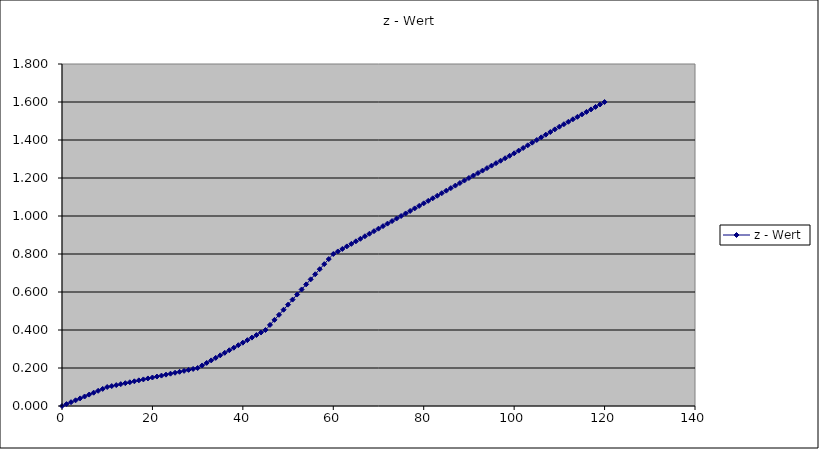
| Category | z - Wert |
|---|---|
| 0.0 | 0 |
| 1.0 | 0.01 |
| 2.0 | 0.02 |
| 3.0 | 0.03 |
| 4.0 | 0.04 |
| 5.0 | 0.05 |
| 6.0 | 0.06 |
| 7.0 | 0.07 |
| 8.0 | 0.08 |
| 9.0 | 0.09 |
| 10.0 | 0.1 |
| 11.0 | 0.105 |
| 12.0 | 0.11 |
| 13.0 | 0.115 |
| 14.0 | 0.12 |
| 15.0 | 0.125 |
| 16.0 | 0.13 |
| 17.0 | 0.135 |
| 18.0 | 0.14 |
| 19.0 | 0.145 |
| 20.0 | 0.15 |
| 21.0 | 0.155 |
| 22.0 | 0.16 |
| 23.0 | 0.165 |
| 24.0 | 0.17 |
| 25.0 | 0.175 |
| 26.0 | 0.18 |
| 27.0 | 0.185 |
| 28.0 | 0.19 |
| 29.0 | 0.195 |
| 30.0 | 0.2 |
| 31.0 | 0.213 |
| 32.0 | 0.227 |
| 33.0 | 0.24 |
| 34.0 | 0.253 |
| 35.0 | 0.267 |
| 36.0 | 0.28 |
| 37.0 | 0.293 |
| 38.0 | 0.307 |
| 39.0 | 0.32 |
| 40.0 | 0.333 |
| 41.0 | 0.347 |
| 42.0 | 0.36 |
| 43.0 | 0.373 |
| 44.0 | 0.387 |
| 45.0 | 0.4 |
| 46.0 | 0.427 |
| 47.0 | 0.453 |
| 48.0 | 0.48 |
| 49.0 | 0.507 |
| 50.0 | 0.533 |
| 51.0 | 0.56 |
| 52.0 | 0.587 |
| 53.0 | 0.613 |
| 54.0 | 0.64 |
| 55.0 | 0.667 |
| 56.0 | 0.693 |
| 57.0 | 0.72 |
| 58.0 | 0.747 |
| 59.0 | 0.773 |
| 60.0 | 0.8 |
| 61.0 | 0.813 |
| 62.0 | 0.827 |
| 63.0 | 0.84 |
| 64.0 | 0.853 |
| 65.0 | 0.867 |
| 66.0 | 0.88 |
| 67.0 | 0.893 |
| 68.0 | 0.907 |
| 69.0 | 0.92 |
| 70.0 | 0.933 |
| 71.0 | 0.947 |
| 72.0 | 0.96 |
| 73.0 | 0.973 |
| 74.0 | 0.987 |
| 75.0 | 1 |
| 76.0 | 1.013 |
| 77.0 | 1.027 |
| 78.0 | 1.04 |
| 79.0 | 1.053 |
| 80.0 | 1.067 |
| 81.0 | 1.08 |
| 82.0 | 1.093 |
| 83.0 | 1.107 |
| 84.0 | 1.12 |
| 85.0 | 1.133 |
| 86.0 | 1.147 |
| 87.0 | 1.16 |
| 88.0 | 1.173 |
| 89.0 | 1.187 |
| 90.0 | 1.2 |
| 91.0 | 1.213 |
| 92.0 | 1.226 |
| 93.0 | 1.239 |
| 94.0 | 1.252 |
| 95.0 | 1.265 |
| 96.0 | 1.278 |
| 97.0 | 1.291 |
| 98.0 | 1.304 |
| 99.0 | 1.317 |
| 100.0 | 1.33 |
| 101.0 | 1.344 |
| 102.0 | 1.358 |
| 103.0 | 1.372 |
| 104.0 | 1.386 |
| 105.0 | 1.4 |
| 106.0 | 1.414 |
| 107.0 | 1.428 |
| 108.0 | 1.442 |
| 109.0 | 1.456 |
| 110.0 | 1.47 |
| 111.0 | 1.483 |
| 112.0 | 1.496 |
| 113.0 | 1.509 |
| 114.0 | 1.522 |
| 115.0 | 1.535 |
| 116.0 | 1.548 |
| 117.0 | 1.561 |
| 118.0 | 1.574 |
| 119.0 | 1.587 |
| 120.0 | 1.6 |